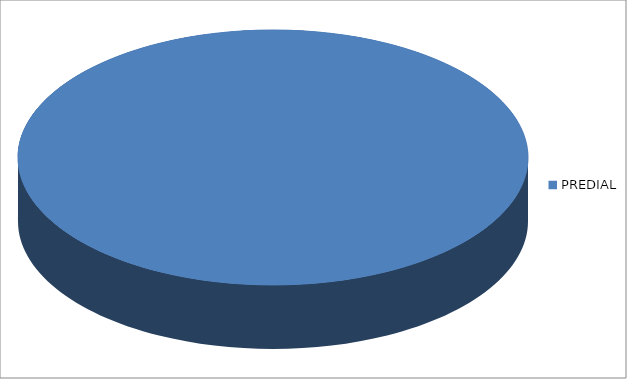
| Category | Series 0 |
|---|---|
| PREDIAL | 16 |